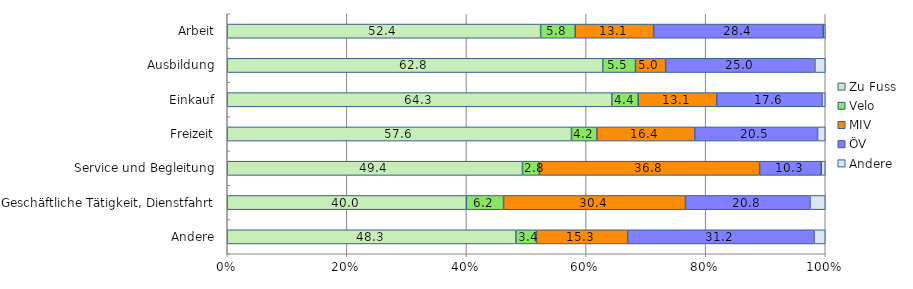
| Category | Zu Fuss | Velo | MIV | ÖV | Andere |
|---|---|---|---|---|---|
| Arbeit | 52.406 | 5.779 | 13.109 | 28.378 | 0.328 |
| Ausbildung | 62.791 | 5.478 | 5.045 | 24.951 | 1.735 |
| Einkauf | 64.306 | 4.42 | 13.132 | 17.6 | 0.543 |
| Freizeit | 57.562 | 4.249 | 16.369 | 20.533 | 1.286 |
| Service und Begleitung | 49.373 | 2.827 | 36.827 | 10.305 | 0.669 |
| Geschäftliche Tätigkeit, Dienstfahrt | 39.985 | 6.224 | 30.416 | 20.82 | 2.556 |
| Andere | 48.261 | 3.439 | 15.261 | 31.165 | 1.876 |